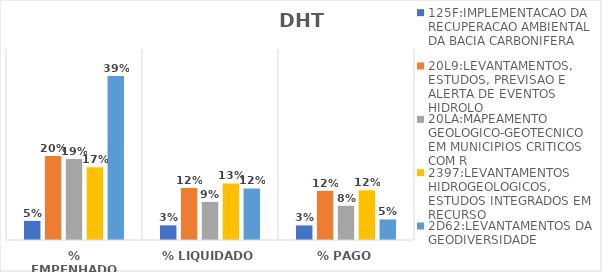
| Category | 125F:IMPLEMENTACAO DA RECUPERACAO AMBIENTAL DA BACIA CARBONIFERA | 20L9:LEVANTAMENTOS, ESTUDOS, PREVISAO E ALERTA DE EVENTOS HIDROLO | 20LA:MAPEAMENTO GEOLOGICO-GEOTECNICO EM MUNICIPIOS CRITICOS COM R | 2397:LEVANTAMENTOS HIDROGEOLOGICOS, ESTUDOS INTEGRADOS EM RECURSO | 2D62:LEVANTAMENTOS DA GEODIVERSIDADE |
|---|---|---|---|---|---|
| % EMPENHADO | 0.045 | 0.198 | 0.191 | 0.171 | 0.387 |
| % LIQUIDADO | 0.035 | 0.123 | 0.09 | 0.133 | 0.121 |
| % PAGO | 0.034 | 0.116 | 0.081 | 0.117 | 0.048 |